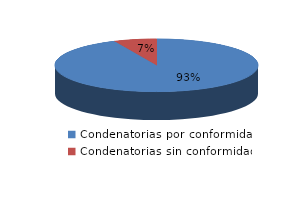
| Category | Series 0 |
|---|---|
| 0 | 674 |
| 1 | 49 |